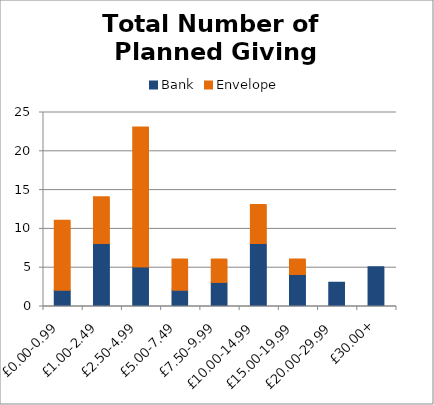
| Category | Bank | Envelope |
|---|---|---|
| £0.00-0.99 | 2 | 9 |
| £1.00-2.49 | 8 | 6 |
| £2.50-4.99 | 5 | 18 |
| £5.00-7.49 | 2 | 4 |
| £7.50-9.99 | 3 | 3 |
| £10.00-14.99 | 8 | 5 |
| £15.00-19.99 | 4 | 2 |
| £20.00-29.99 | 3 | 0 |
| £30.00+ | 5 | 0 |